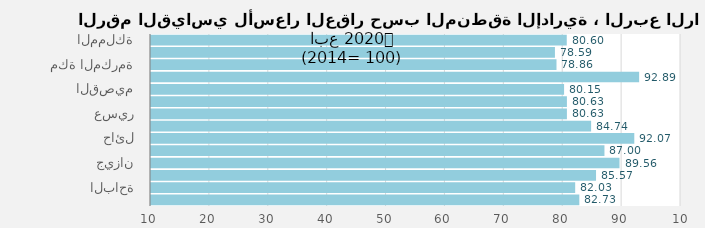
| Category | 2020 |
|---|---|
| المملكة | 80.6 |
| الرياض | 78.593 |
| مكة المكرمة | 78.857 |
| المدينة المنورة | 92.891 |
| القصيم | 80.146 |
| المنطقة الشرقية | 80.626 |
| عسير | 80.626 |
| تبوك | 84.735 |
| حائل | 92.069 |
| المنطقة الشمالية | 87.002 |
| جيزان | 89.557 |
| نجران | 85.572 |
| الباحة | 82.031 |
| الجوف | 82.734 |